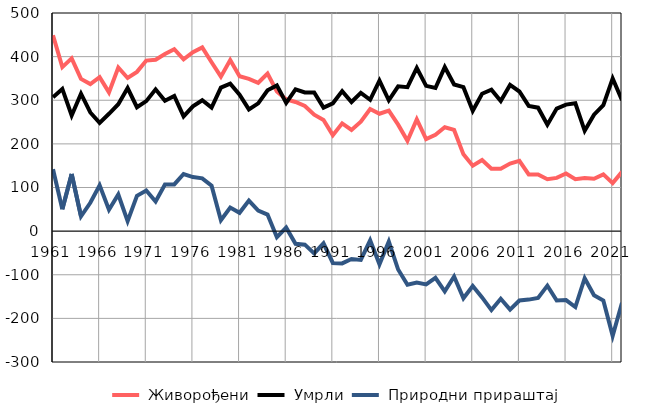
| Category |  Живорођени |  Умрли |  Природни прираштај |
|---|---|---|---|
| 1961.0 | 449 | 307 | 142 |
| 1962.0 | 376 | 326 | 50 |
| 1963.0 | 396 | 265 | 131 |
| 1964.0 | 349 | 315 | 34 |
| 1965.0 | 337 | 272 | 65 |
| 1966.0 | 353 | 248 | 105 |
| 1967.0 | 318 | 269 | 49 |
| 1968.0 | 375 | 291 | 84 |
| 1969.0 | 351 | 328 | 23 |
| 1970.0 | 365 | 284 | 81 |
| 1971.0 | 391 | 298 | 93 |
| 1972.0 | 393 | 325 | 68 |
| 1973.0 | 406 | 299 | 107 |
| 1974.0 | 417 | 310 | 107 |
| 1975.0 | 394 | 263 | 131 |
| 1976.0 | 410 | 286 | 124 |
| 1977.0 | 421 | 300 | 121 |
| 1978.0 | 387 | 283 | 104 |
| 1979.0 | 354 | 329 | 25 |
| 1980.0 | 392 | 338 | 54 |
| 1981.0 | 355 | 313 | 42 |
| 1982.0 | 349 | 279 | 70 |
| 1983.0 | 340 | 293 | 47 |
| 1984.0 | 361 | 323 | 38 |
| 1985.0 | 320 | 334 | -14 |
| 1986.0 | 302 | 294 | 8 |
| 1987.0 | 296 | 325 | -29 |
| 1988.0 | 287 | 318 | -31 |
| 1989.0 | 267 | 318 | -51 |
| 1990.0 | 255 | 283 | -28 |
| 1991.0 | 220 | 293 | -73 |
| 1992.0 | 247 | 321 | -74 |
| 1993.0 | 232 | 296 | -64 |
| 1994.0 | 251 | 317 | -66 |
| 1995.0 | 280 | 301 | -21 |
| 1996.0 | 269 | 345 | -76 |
| 1997.0 | 276 | 300 | -24 |
| 1998.0 | 244 | 332 | -88 |
| 1999.0 | 207 | 330 | -123 |
| 2000.0 | 256 | 374 | -118 |
| 2001.0 | 211 | 333 | -122 |
| 2002.0 | 221 | 328 | -107 |
| 2003.0 | 238 | 376 | -138 |
| 2004.0 | 232 | 336 | -104 |
| 2005.0 | 176 | 330 | -154 |
| 2006.0 | 150 | 276 | -126 |
| 2007.0 | 163 | 315 | -152 |
| 2008.0 | 143 | 324 | -181 |
| 2009.0 | 143 | 298 | -155 |
| 2010.0 | 155 | 335 | -180 |
| 2011.0 | 161 | 320 | -159 |
| 2012.0 | 130 | 287 | -157 |
| 2013.0 | 130 | 283 | -153 |
| 2014.0 | 119 | 244 | -125 |
| 2015.0 | 122 | 281 | -159 |
| 2016.0 | 132 | 290 | -158 |
| 2017.0 | 119 | 293 | -174 |
| 2018.0 | 122 | 230 | -108 |
| 2019.0 | 120 | 267 | -147 |
| 2020.0 | 130 | 289 | -159 |
| 2021.0 | 110 | 350 | -240 |
| 2022.0 | 136 | 300 | -164 |